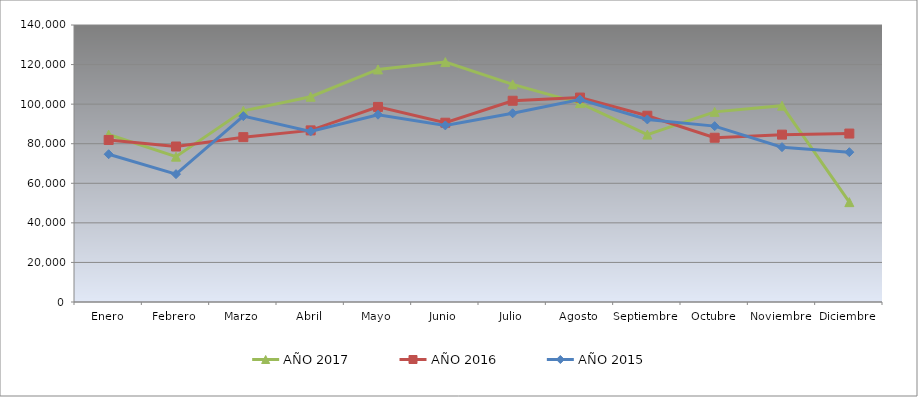
| Category | AÑO 2017 | AÑO 2016 | AÑO 2015 |
|---|---|---|---|
| Enero | 84635.897 | 81893.302 | 74690.577 |
| Febrero | 73463.932 | 78584.687 | 64616.034 |
| Marzo | 96615.385 | 83317.563 | 93937.764 |
| Abril | 103757.265 | 86741.202 | 86221.519 |
| Mayo | 117538.462 | 98602.147 | 94659.283 |
| Junio | 121244.444 | 90618.168 | 89247.89 |
| Julio | 109996.581 | 101721.312 | 95380.802 |
| Agosto | 100533.333 | 103318.108 | 102308.72 |
| Septiembre | 84611.966 | 94143.298 | 92274.262 |
| Octubre | 96102.564 | 83019.855 | 88887.131 |
| Noviembre | 99220.513 | 84589.587 | 78244.726 |
| Diciembre | 50475.214 | 85137.64 | 75719.409 |